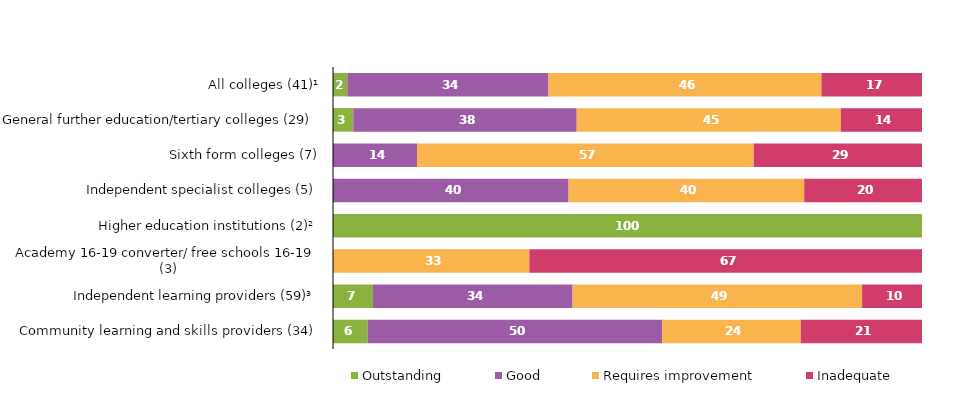
| Category | Outstanding | Good | Requires improvement | Inadequate |
|---|---|---|---|---|
| All colleges (41)¹ | 2.439 | 34.146 | 46.341 | 17.073 |
| General further education/tertiary colleges (29) | 3.448 | 37.931 | 44.828 | 13.793 |
| Sixth form colleges (7) | 0 | 14.286 | 57.143 | 28.571 |
| Independent specialist colleges (5) | 0 | 40 | 40 | 20 |
| Higher education institutions (2)² | 100 | 0 | 0 | 0 |
| Academy 16-19 converter/ free schools 16-19 (3) | 0 | 0 | 33.333 | 66.667 |
| Independent learning providers (59)³ | 6.78 | 33.898 | 49.153 | 10.169 |
| Community learning and skills providers (34) | 5.882 | 50 | 23.529 | 20.588 |